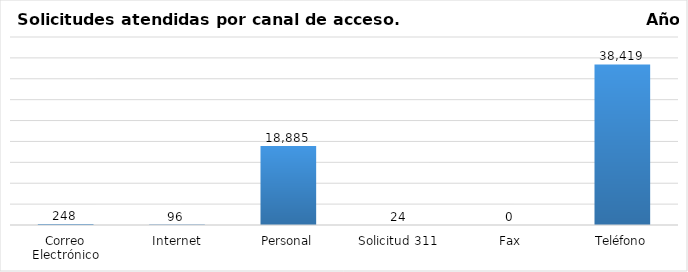
| Category | Total |
|---|---|
| Correo Electrónico | 248 |
| Internet | 96 |
| Personal | 18885 |
| Solicitud 311 | 24 |
| Fax | 0 |
| Teléfono | 38419 |